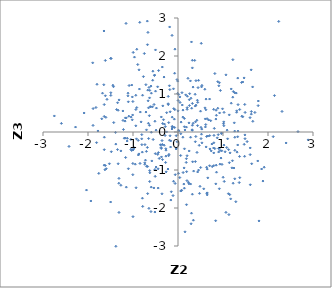
| Category | Series 0 |
|---|---|
| -1.102029423633813 | -0.966 |
| 0.7908879978934871 | -0.421 |
| -0.27556302103878855 | -0.802 |
| -2.747367247011014 | 0.423 |
| -3.1949568083130724 | 0.745 |
| 0.5038649076492004 | -0.935 |
| 0.8839118458696036 | 1.324 |
| 0.14350253139176525 | -0.442 |
| 0.5322467427140197 | -0.286 |
| 1.021185996347559 | -0.345 |
| 1.1412382089260609 | -0.808 |
| -0.0991714818864685 | -1.297 |
| -0.3558198685077348 | -1.626 |
| 0.4227002642555656 | -0.538 |
| -1.1751427147679252 | 0.287 |
| -0.3063412129966727 | -0.348 |
| -0.04111881291269347 | -0.447 |
| -1.169521394696239 | -0.161 |
| -0.865962326733689 | 1.636 |
| -0.2514199827109622 | 0.508 |
| -0.8070754284660786 | -0.18 |
| 1.4866507680296572 | -0.077 |
| -0.5075005413207785 | -1.167 |
| 1.3048917449702766 | 0.557 |
| -0.1316277497971539 | 2.542 |
| 0.4888161850097561 | -1.43 |
| 0.18698441630295726 | -0.703 |
| 0.9239345203351936 | 0.502 |
| -0.9489303175633281 | -0.847 |
| 1.4707426169575668 | -0.324 |
| -1.103451761083985 | 0.794 |
| -0.3443104158484744 | -0.726 |
| -0.7130676308306502 | 1.246 |
| -0.6678270454916722 | 2.621 |
| 0.20149537150902821 | -0.625 |
| 0.5105988322731327 | 0.122 |
| 0.011057751237574224 | 0.047 |
| -0.9976027675328284 | -0.472 |
| 0.4564421262031286 | 1.36 |
| -1.3112771463722501 | -2.118 |
| -1.0040647144425323 | -1.123 |
| 0.8189321560115326 | 1.538 |
| -0.20751805239690652 | -0.623 |
| 0.6806552083919546 | 0.316 |
| 0.6229929696172802 | 0.866 |
| -0.4168827192891755 | -0.696 |
| -1.0277120358354135 | 1.236 |
| -1.0157130725738217 | 0.32 |
| -0.931683903831627 | -1.468 |
| -1.1293671327670127 | -0.238 |
| 0.31471330857406143 | 0.057 |
| 1.6063495667144887 | -1.389 |
| 0.05978264962666141 | -0.619 |
| -0.6317969971157086 | 0.898 |
| -1.8091450830244586 | -0.28 |
| -0.007355848081519689 | 1.019 |
| 1.199058023540162 | -0.943 |
| -0.7349436324705919 | -0.332 |
| 0.7369309453337193 | -0.497 |
| -1.3425996002581653 | 0.77 |
| -1.6385146137877442 | -0.466 |
| -0.7929967339450027 | -0.529 |
| 1.6626564885572792 | 0.281 |
| 0.7037546545549794 | -0.095 |
| 0.9033674634949269 | -0.528 |
| -1.3308495518987848 | 0.572 |
| 1.0271821052961603 | -1.301 |
| 0.3039313456525383 | 0.626 |
| -0.08083958070637211 | 0.339 |
| 0.7095206096846114 | -0.446 |
| -0.5917555306258816 | 1.022 |
| -1.6366590558233793 | -0.136 |
| -1.029742205019149 | -0.486 |
| 1.6304112305621783 | 0.539 |
| 0.3958235955864195 | -0.119 |
| -1.0081738438344847 | 0.449 |
| 0.34192724842433614 | -2.321 |
| -0.680628739015649 | -0.406 |
| -0.532725701373939 | 0.724 |
| 0.3196588892505018 | 0.752 |
| 0.09508822887264082 | 0.71 |
| -0.6751281697920927 | -0.907 |
| 0.061341903255768604 | -1.554 |
| -2.0864304788553367 | 0.5 |
| -0.6367040729885977 | 0.429 |
| 0.5240537524021566 | 1.187 |
| -1.6159341052226945 | -0.882 |
| 1.3349347563465321 | 0.72 |
| -0.592958406806188 | -0.007 |
| -0.711864164364629 | 0.525 |
| 0.041885259797501 | 0.923 |
| 1.2429536370141916 | -0.948 |
| 0.79601123260419 | -0.885 |
| 0.27601967418844625 | 1.344 |
| 0.930961488284492 | -0.845 |
| -0.21690565420194288 | 0.937 |
| -0.5819496774587807 | -0.762 |
| 0.438027347938239 | 0.78 |
| 1.4896710479433994 | -0.176 |
| 0.6071635152449444 | 0.344 |
| -0.8494293319100932 | 2.886 |
| 1.019310959763459 | 0.165 |
| 0.6489449431963306 | -1.656 |
| -0.9164601899810245 | 0.643 |
| -0.09428710467009477 | 0.615 |
| 1.0235752705086674 | 0.517 |
| 0.5966715933910058 | 1.125 |
| -0.7234482283705923 | -0.741 |
| -0.45147822540133825 | -0.59 |
| -0.07479430268593149 | 1.546 |
| 1.6014202388196679 | 0.378 |
| 0.2588380279759616 | 1.008 |
| 1.1702176668603124 | -1.76 |
| -0.18832592701975304 | -0.216 |
| 0.3347904145458357 | 1.182 |
| 0.625916307542725 | -0.393 |
| -2.27687139384866 | 0.13 |
| 0.009974572339399254 | -1.088 |
| -0.8811150957766827 | -0.605 |
| 2.8918828813005826 | -0.208 |
| 1.6263139488485647 | 1.635 |
| -0.6005105634168294 | 1.209 |
| -1.014260009568081 | 0.922 |
| 2.2381153394619497 | 2.91 |
| 0.31891879646736304 | 0.176 |
| 1.1572721795933276 | -0.549 |
| -0.2184309450557264 | 0.743 |
| -1.5239359810251016 | -0.836 |
| 0.24431562074152866 | 0.24 |
| -0.8042640623890519 | -0.07 |
| -1.3638330863236054 | 0.592 |
| -1.1486151920329795 | 0.371 |
| 1.10266199665978 | -0.18 |
| 0.4465889534961745 | 1.168 |
| -0.47925531083083006 | 0.629 |
| 1.0656588130278997 | 1.504 |
| -0.20118875010441434 | -0.589 |
| 1.8001087760902619 | -2.34 |
| 0.8454892185239621 | 0.573 |
| 0.28012441453242665 | -1.37 |
| 0.7015556983621407 | -0.887 |
| 1.0650442796820787 | -2.115 |
| -1.4279655761304828 | 0.248 |
| -0.4871473488844223 | 0.049 |
| 0.3988214992072031 | 1.351 |
| 1.4692499914136017 | 1.423 |
| 0.45660609840358296 | -1.002 |
| -0.955557713861447 | 3.056 |
| -0.2818856176884169 | 0.142 |
| -0.37147232755944104 | -0.434 |
| 1.3137128207428215 | -0.529 |
| -1.5777500727743372 | 0.859 |
| -0.5128797310873852 | -2.107 |
| -1.623368277698152 | -0.994 |
| -1.641064461292161 | -0.872 |
| 0.2218347625921274 | 1.413 |
| -1.1123046956930887 | 0.952 |
| 0.9664279101077717 | -0.045 |
| -0.8442460613460671 | -0.828 |
| 1.6296099143350664 | 0.471 |
| 1.6378586960055386 | -0.836 |
| -0.20618434224577845 | 0.247 |
| -0.8568139025530846 | 1.13 |
| -1.314449829167396 | -1.349 |
| -1.3803985094253435 | -3.008 |
| 1.0831917757487077 | -0.408 |
| -1.38181465011514 | -0.319 |
| 0.7273360583315661 | 0.296 |
| 1.602944140240446 | -0.596 |
| -1.79999581634109 | 1.256 |
| -0.935960324326583 | 0.592 |
| 0.3805100736227874 | 0.993 |
| 0.3851734031162916 | -0.256 |
| 0.10773376636186366 | 0.392 |
| -1.5941789699274254 | -0.967 |
| 1.149797841965159 | -1.648 |
| -1.6942822339055463 | 0.347 |
| 1.4833924275059727 | 0.724 |
| 0.14164935195092151 | -1.478 |
| -0.9676979316674476 | 1.971 |
| -0.7483828592312606 | 2.065 |
| -0.11756134441057015 | 0.117 |
| -0.039926484813362514 | -0.097 |
| -1.224431960326668 | 0.553 |
| 0.0031969334985623887 | 0.829 |
| -0.6714134864372038 | 1.102 |
| 1.3678048355957446 | -0.643 |
| -1.269463445495561 | -0.498 |
| 1.3329489547916775 | 0.024 |
| -0.7685544765022038 | 1.457 |
| 0.5167173800533685 | 2.334 |
| 0.9768798749798483 | -0.853 |
| 0.8939696352829597 | -0.07 |
| 0.18943635314635593 | -1.914 |
| -0.3227332390602049 | 0.323 |
| 0.7604128171401648 | -0.91 |
| -0.3548513536322406 | -0.225 |
| -0.8373558951598199 | 0.525 |
| -1.4971539501925117 | -1.843 |
| -1.4336916628104404 | 1.192 |
| -0.2630251911482875 | -1.049 |
| -1.759392180920239 | -1.089 |
| 0.18247863921248916 | -0.801 |
| 1.3271338816753486 | -0.342 |
| 0.021206290390861887 | 0.021 |
| -0.06443199296843176 | -1.353 |
| -0.5577785232766761 | 1.6 |
| 1.011118773575225 | 0.218 |
| 0.24241810375250739 | -1.363 |
| 2.1444249602692187 | 0.958 |
| -0.020715292081749954 | 1.379 |
| -2.0334740939796943 | -1.528 |
| -0.10031289339330314 | 1.136 |
| -0.5122952077373294 | -0.987 |
| -0.5120216648087976 | 0.283 |
| 1.4404065565434918 | 0.401 |
| -0.12758709455527747 | 0.147 |
| 1.2252115606821836 | -1.348 |
| -0.16069596677350895 | -0.235 |
| 0.27931495943167994 | -0.138 |
| -0.6280572906993236 | 1.096 |
| 0.9895262357117731 | 0.611 |
| -1.3439059921395717 | -0.462 |
| -1.0404747056467145 | 0.393 |
| -1.4863922044135298 | 1.933 |
| -0.2869564155487564 | -0.092 |
| 0.3708992493390731 | 1.884 |
| -0.03578823046262308 | -0.423 |
| -0.17674155830222196 | -0.099 |
| 1.857795878517939 | -0.974 |
| -0.6637866096084553 | 0.82 |
| -0.6011975968386465 | -2.094 |
| -0.26723275641277777 | -0.478 |
| 0.32510605490600486 | -0.784 |
| 1.259220407028964 | 0.023 |
| -0.4400376302107012 | -1.475 |
| 0.8418470475223312 | 0.34 |
| -0.13398216256332326 | 0.079 |
| 1.7808960696903726 | 0.694 |
| -0.738902466651591 | -0.811 |
| 0.5997033317870086 | 0.635 |
| -0.6978429259742062 | -0.903 |
| -1.6488255792184094 | 1.244 |
| -1.8860773083151885 | 0.615 |
| 0.38325413214899123 | 0.682 |
| 0.7529369793957252 | -0.316 |
| -0.5520714118515996 | -0.197 |
| -0.17339175587369407 | 0.532 |
| -0.07064739121750792 | 0.59 |
| 0.6093929702248203 | 0.133 |
| 0.5215447414044415 | -0.058 |
| 1.6576447017434404 | 1.186 |
| -0.9378232005593492 | 0.967 |
| 0.19150600877250112 | -1.044 |
| -0.1650092679780113 | -0.396 |
| -1.3667635077364362 | -3.179 |
| 1.4175943088080687 | 0.415 |
| -1.4458898340941895 | 1.231 |
| 0.9192735133860657 | 1.296 |
| -1.1480749763857832 | -1.451 |
| 0.3193080916847106 | -1.637 |
| -0.3672686563907712 | -0.656 |
| 0.38610975549724114 | -0.779 |
| -0.4877444071125257 | -0.922 |
| -0.07436665139882444 | 0.119 |
| 1.1834929865149866 | 0.758 |
| -0.06839761763428216 | 2.18 |
| -1.1939529564549112 | -0.163 |
| 0.061979880823167674 | -0.045 |
| 0.1362309623877208 | -0.945 |
| 0.04516518495908335 | 0.778 |
| -1.6395557222090542 | 0.723 |
| 0.646641246868292 | 0.351 |
| -0.6813002459184825 | 2.918 |
| -0.2227153271435946 | -0.975 |
| -1.163926079616379 | -0.671 |
| 0.15602962419906552 | -2.627 |
| 0.9187041941064205 | -0.422 |
| 0.039528493985853286 | -1.2 |
| -1.7790975126365896 | 0.027 |
| -1.492231616743408 | 0.964 |
| 1.0468110265291048 | -0.521 |
| 1.0029949833614498 | -1.191 |
| -0.49926552095401017 | 1.075 |
| -0.3487516816425356 | 1.709 |
| -0.8850373911999072 | -0.221 |
| -0.8191370974399224 | 0.266 |
| -0.790971848792963 | -1.742 |
| 0.15520604617324826 | 0.053 |
| -0.4997574066104778 | 2.16 |
| -0.5945587728896413 | -1.45 |
| -1.3120902014598916 | -1.221 |
| 0.5119293891244956 | -0.174 |
| -0.006032189059351403 | 1.339 |
| -0.12872751906267507 | 0.391 |
| -0.5623801235283897 | 1.362 |
| -0.3759482155151792 | -0.409 |
| 0.9667181075049736 | -0.025 |
| 1.3265542398557542 | -0.126 |
| -0.9231759089514534 | -0.18 |
| 2.1159440859090166 | -0.123 |
| 0.0017317405288044968 | 0.556 |
| -1.0468386672856334 | -0.196 |
| -0.8025216743905937 | -0.333 |
| 2.3115481169750938 | 0.54 |
| -0.5203645263242568 | 1.5 |
| 0.5311130499107085 | 1.227 |
| 0.8533912229195552 | 0.44 |
| -0.6285140611519648 | -1.303 |
| 0.20291756421916302 | 0.596 |
| 0.5716246971032809 | -1.496 |
| 0.8184634906412542 | -0.437 |
| -0.18115258808122592 | 1.115 |
| -0.6997392544360094 | 0.057 |
| 1.3731012141990222 | -1.202 |
| -0.7022697739485367 | -0.51 |
| 0.5009471963370651 | 0.548 |
| 0.8556875283256553 | -1.058 |
| -0.38855410345008834 | -0.34 |
| 0.9346946197896343 | -0.487 |
| 0.3188174216162417 | 1.888 |
| 1.5361031108431207 | -0.253 |
| -1.1548492408952478 | 2.858 |
| -0.34138663658255397 | 0.225 |
| -0.9683634582341951 | -0.414 |
| 0.4354033935830378 | 0.167 |
| 1.4126593486963048 | 1.303 |
| 1.7850667279531052 | 0.816 |
| -1.4963705653703498 | 1.939 |
| 0.4365020320278661 | -1.052 |
| 1.1201708702191955 | -1.624 |
| -0.6164254062529412 | 0.667 |
| 0.14124075552224552 | 0.358 |
| 1.7722821603671028 | -0.763 |
| 0.8402266031342159 | -1.365 |
| 1.0168669318490866 | 0.267 |
| 1.3600053843871542 | -1.331 |
| 0.848911898339785 | -0.873 |
| -0.21527342168735356 | 0.719 |
| 0.6496147534233734 | -0.976 |
| 0.014754875254371547 | 0.988 |
| -1.2686024810709842 | -1.402 |
| 1.285187132016923 | -1.834 |
| -0.38164697367522893 | -0.335 |
| 0.6627688089821346 | -1.207 |
| -0.18608834247051081 | 2.764 |
| -1.4928531166064383 | 1.033 |
| 0.7921332107360444 | 0.597 |
| -0.67443471326858 | -1.622 |
| -1.0031618257734003 | -0.828 |
| 0.9051472530992921 | -0.435 |
| -0.6436093247513519 | 1.173 |
| 0.41854720660055716 | 0.31 |
| -0.6528979694365825 | -0.172 |
| 0.7990782666048477 | -0.089 |
| -1.0470370111327294 | -0.456 |
| 0.9556498366032982 | -0.686 |
| -0.344405959235625 | -0.328 |
| 0.6352005599560627 | -0.118 |
| -1.0868396137509084 | 1.223 |
| 0.10922846414995298 | -0.137 |
| 0.06928809320180805 | 0.26 |
| 0.1867396244693451 | 0.129 |
| -1.1259799170442795 | -0.166 |
| -1.3294437606724465 | -0.836 |
| -1.2213502424812779 | 0.304 |
| 1.1242812333572927 | -0.464 |
| 0.9083236517349604 | 1.216 |
| -0.31070932039491644 | 1.446 |
| -1.1688171452317417 | 0.371 |
| 1.2615270573965176 | -1.232 |
| 0.233919190594285 | -1.325 |
| 0.8840973361773566 | 0.625 |
| -0.6253878624294836 | -1.074 |
| -1.6397923825171548 | 0.409 |
| -1.6137880022102133 | 0.953 |
| -0.8943210934467836 | 1.776 |
| 0.38929770171883177 | 0.267 |
| 0.39937625753542233 | 0.706 |
| -0.9157093433083734 | 2.178 |
| 0.2515141912000413 | 0.849 |
| -1.3881758314583659 | -0.012 |
| 1.3280112860045354 | 1.419 |
| 0.6617964131705218 | -0.107 |
| -0.27153810481634544 | -0.441 |
| 1.2943416920651456 | 1.024 |
| -0.4311601895606326 | 1.616 |
| 1.439122314311153 | 1.316 |
| -0.8684220476142296 | -0.577 |
| 0.4782233031501046 | -1.615 |
| -0.019483207808659773 | -0.257 |
| -0.5235698878581543 | 1.486 |
| -0.2690899220644732 | -0.635 |
| 1.1829202143384874 | 1.132 |
| 0.2044540243499621 | 0.64 |
| 0.33630872095639475 | 0.229 |
| -0.654188350934178 | 0.635 |
| 1.7090547887596261 | 0.514 |
| 0.34741143917956446 | -1.029 |
| 0.20841617685451777 | 0.942 |
| -0.6335540575791757 | 0.176 |
| 0.9714906429288325 | -0.495 |
| 1.1953155414155063 | 3.213 |
| -1.6451098513282418 | 2.658 |
| -0.7377961811248858 | -0.85 |
| -0.9955350993111 | 2.094 |
| 0.8735857516551903 | -0.154 |
| 1.0915548825294568 | 0.05 |
| -0.9965489922047241 | -0.456 |
| -1.9366929566239441 | -1.816 |
| 1.3022122325809597 | 0.519 |
| -0.14843935700832026 | -1.573 |
| -0.7881270586744318 | 0.968 |
| 0.6164135262494314 | 0.196 |
| 1.1404515995688003 | 0.45 |
| -0.4354450894886854 | -0.542 |
| -0.10937649551143794 | -1.673 |
| 1.6051704627471792 | -0.42 |
| -1.0025892736734794 | 0.802 |
| -0.3374633332191665 | 0.687 |
| 0.7947708905267528 | -0.551 |
| -1.8224643703905121 | 0.645 |
| -0.5035820272268166 | -0.569 |
| -1.3092491220790863 | 0.844 |
| -0.15926123147279522 | -1.791 |
| 0.3167121915298408 | 0.045 |
| -0.5666948374762925 | 0.664 |
| 0.6206218459914407 | 0.585 |
| -0.5366829390152237 | -1.472 |
| 0.08845765210584526 | 1.035 |
| 0.17090095017267076 | 0.977 |
| 1.370921594293296 | 0.593 |
| 0.14258248364281845 | 0.139 |
| 0.07369870473280425 | -1.543 |
| 1.2200280659173606 | 1.904 |
| -1.8959360035731485 | 1.82 |
| -0.9371971932168891 | 0.163 |
| -1.2119481299628523 | 0.066 |
| 1.2174779652379952 | 0.916 |
| 0.28911441349050604 | 0.889 |
| 0.29950812982269875 | 2.37 |
| 0.7018043770481543 | 0.867 |
| -0.6777451742281647 | 2.297 |
| 0.29964061406109543 | -2.137 |
| -1.6029944383490045 | 0.385 |
| -1.6777770114764843 | 1.021 |
| 1.2639629876674234 | -0.483 |
| 0.1138906074996571 | -1.068 |
| 0.47093679167283303 | -0.351 |
| 1.9154125586037924 | -0.926 |
| 1.887619220136567 | -1.291 |
| 0.635809555973765 | -0.928 |
| -0.6566156381819507 | 0.23 |
| 1.4798277834156597 | -0.64 |
| 2.4024401014496353 | -0.289 |
| -0.061598275008925396 | -1.124 |
| -0.37027147445570524 | 0.396 |
| 0.0798908939364038 | -1.532 |
| -0.6064214108640397 | 0.661 |
| -0.6294362441819797 | -1.016 |
| 1.2293832119410872 | 1.064 |
| 1.2518765888231267 | 0.241 |
| -1.0001761227671453 | -2.228 |
| 0.3196362296955413 | 1.687 |
| -0.6465720810960017 | -2.009 |
| 0.9184026391284825 | -1.493 |
| 0.5290899821840127 | 0.076 |
| 0.2905823761013316 | -2.415 |
| 1.4913049738488675 | 0.515 |
| -2.4216494081287974 | -0.38 |
| 1.1314768719778272 | -2.173 |
| 1.2621618809497377 | -0.139 |
| -1.0923583932579746 | 0.417 |
| 0.8070040534085594 | 0.095 |
| 0.19951266249849312 | -1.281 |
| 0.8367455239594389 | -2.336 |
| -0.25338323182371497 | 0.002 |
| -1.6151767638898147 | 1.883 |
| 0.7965278139391297 | -0.284 |
| -1.1104336657378362 | 1.021 |
| -0.784414143233157 | -1.958 |
| -2.591664229134939 | 0.227 |
| 1.210516236642121 | -0.756 |
| 0.11068355754573572 | 0.576 |
| -0.44225954818257873 | -0.969 |
| -0.1899962934908977 | 1.217 |
| 0.2489999214102982 | -0.499 |
| -1.4816123618085508 | -0.519 |
| 1.2582383591840942 | 1.034 |
| -1.8877879508230184 | 0.173 |
| -0.12341402523276386 | 0.135 |
| -0.45292403826060257 | 1.189 |
| 0.43063548383490746 | 0.836 |
| 0.6490297770714963 | -1.603 |
| 0.9424259706453735 | 1.093 |
| 0.6407913412396472 | -1.611 |
| 2.666388595893971 | 0.01 |
| -0.30161278436002864 | 0.208 |
| 0.2541997486323378 | 0.696 |
| 0.12927345998899478 | -1.37 |